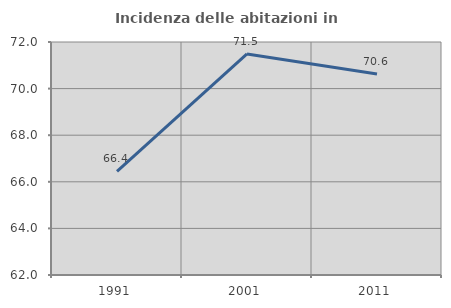
| Category | Incidenza delle abitazioni in proprietà  |
|---|---|
| 1991.0 | 66.449 |
| 2001.0 | 71.487 |
| 2011.0 | 70.631 |